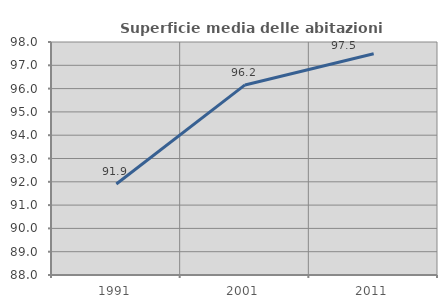
| Category | Superficie media delle abitazioni occupate |
|---|---|
| 1991.0 | 91.904 |
| 2001.0 | 96.158 |
| 2011.0 | 97.494 |